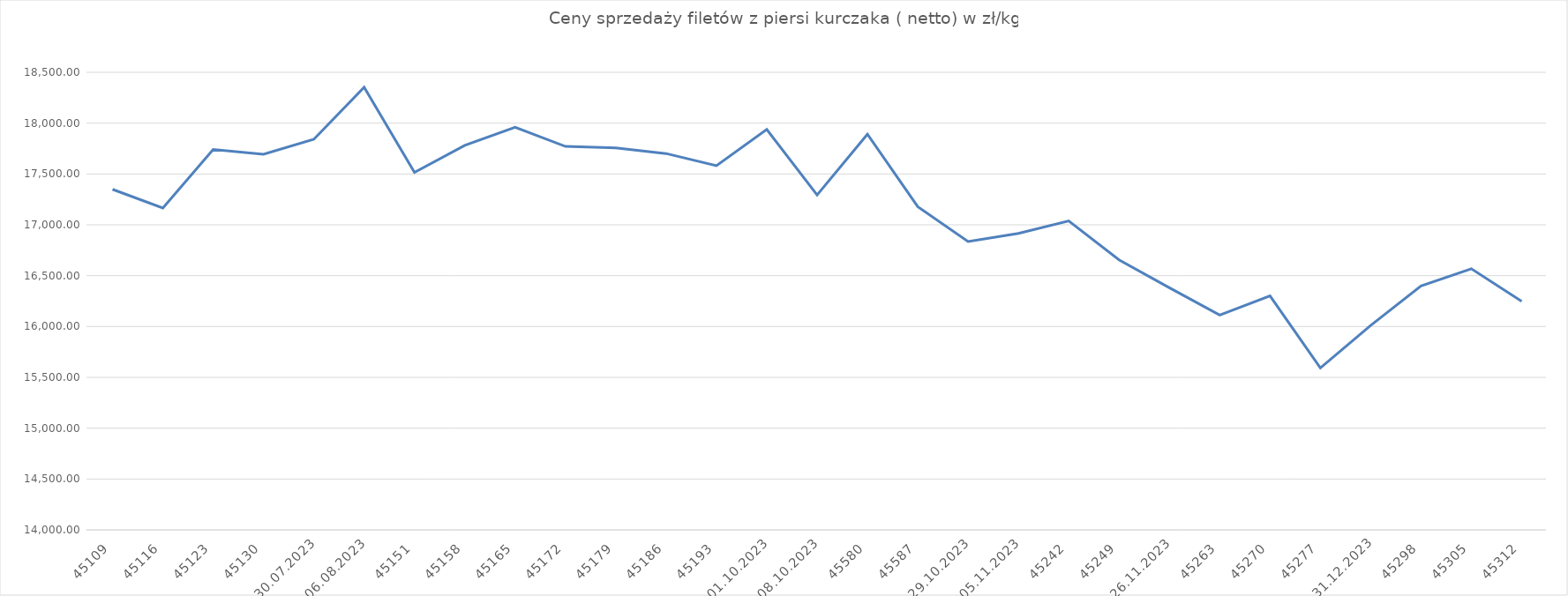
| Category | filety z piersi kurczaka | Series 1 | Series 2 | Series 3 | Series 4 |
|---|---|---|---|---|---|
| 02.07.2023 | 17349.174 |  |  |  |  |
| 09.07.2023 | 17165.546 |  |  |  |  |
| 16.07.2023 | 17741.248 |  |  |  |  |
| 23.07.2023 | 17694.338 |  |  |  |  |
| 30.07.2023 | 17841.429 |  |  |  |  |
| 06.08.2023 | 18352.509 |  |  |  |  |
| 13.08.2023 | 17515.366 |  |  |  |  |
| 20.08.2023 | 17780.664 |  |  |  |  |
| 27.08.2023 | 17960.235 |  |  |  |  |
| 03.09.2023 | 17770.977 |  |  |  |  |
| 10.09.2023 | 17757.167 |  |  |  |  |
| 17.09.2023 | 17701.031 |  |  |  |  |
| 24.09.2023 | 17581.526 |  |  |  |  |
| 01.10.2023 | 17938.153 |  |  |  |  |
| 08.10.2023 | 17293.552 |  |  |  |  |
| 15.10.2024 | 17891.064 |  |  |  |  |
| 22.10.2024 | 17178.092 |  |  |  |  |
| 29.10.2023 | 16835.746 |  |  |  |  |
| 05.11.2023 | 16916.112 |  |  |  |  |
| 12.11.2023 | 17037.647 |  |  |  |  |
| 19.11.2023 | 16654.867 |  |  |  |  |
| 26.11.2023 | 16381.465 |  |  |  |  |
| 03.12.2023 | 16112.396 |  |  |  |  |
| 10.12.2023 | 16301.002 |  |  |  |  |
| 17.12.2023 | 15592.281 |  |  |  |  |
| 18-31.12.2023 | 16010.609 |  |  |  |  |
| 07.01.2024 | 16398.99 |  |  |  |  |
| 14.01.2024 | 16568.176 |  |  |  |  |
| 21.01.2024 | 16247.114 |  |  |  |  |